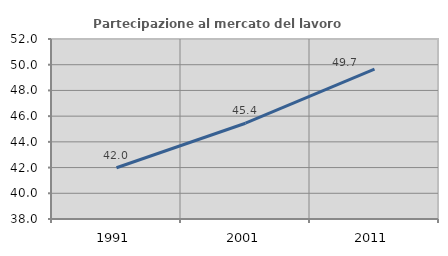
| Category | Partecipazione al mercato del lavoro  femminile |
|---|---|
| 1991.0 | 41.983 |
| 2001.0 | 45.449 |
| 2011.0 | 49.662 |